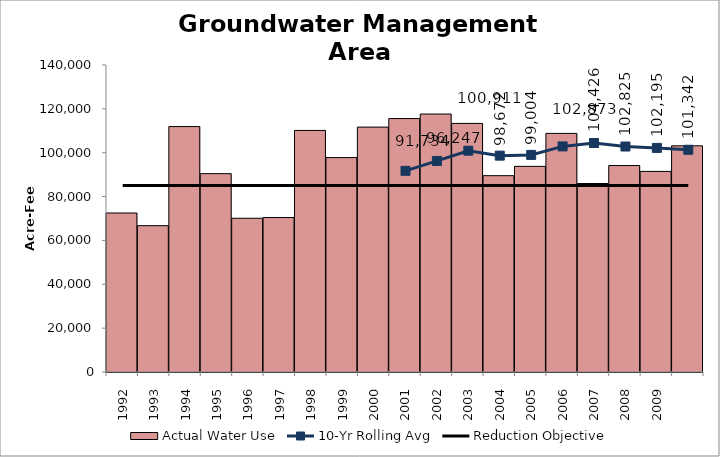
| Category | Actual Water Use |
|---|---|
| 1992.0 | 72507.7 |
| 1993.0 | 66723.81 |
| 1994.0 | 111923.75 |
| 1995.0 | 90455.69 |
| 1996.0 | 70117.68 |
| 1997.0 | 70431.55 |
| 1998.0 | 110158.52 |
| 1999.0 | 97767.93 |
| 2000.0 | 111678.25 |
| 2001.0 | 115578.66 |
| 2002.0 | 117636.69 |
| 2003.0 | 113360.51 |
| 2004.0 | 89531.91 |
| 2005.0 | 93773.78 |
| 2006.0 | 108810.49 |
| 2007.0 | 85958.53 |
| 2008.0 | 94154.57 |
| 2009.0 | 91470.8 |